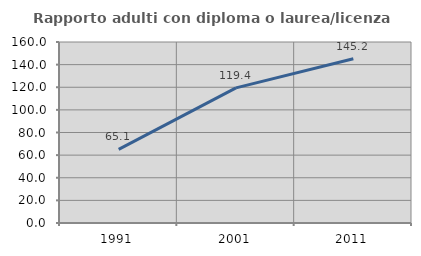
| Category | Rapporto adulti con diploma o laurea/licenza media  |
|---|---|
| 1991.0 | 65.085 |
| 2001.0 | 119.437 |
| 2011.0 | 145.19 |